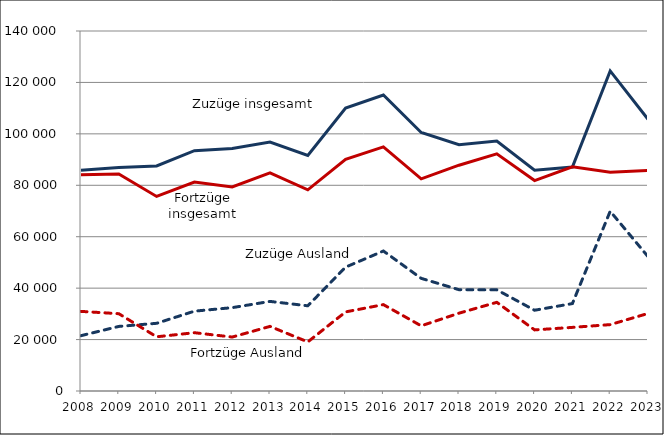
| Category | Zuzüge insgesamt | Zuzüge Ausland | Fortzüge insgesamt | Fortzüge Ausland |
|---|---|---|---|---|
| 2008.0 | 85859 | 21514 | 84108 | 30961 |
| 2009.0 | 86879 | 25112 | 84411 | 30062 |
| 2010.0 | 87538 | 26324 | 75668 | 21078 |
| 2011.0 | 93466 | 31048 | 81231 | 22674 |
| 2012.0 | 94346 | 32412 | 79335 | 20979 |
| 2013.0 | 96782 | 34839 | 84823 | 25125 |
| 2014.0 | 91594 | 33131 | 78218 | 19091 |
| 2015.0 | 110070 | 48173 | 90072 | 30757 |
| 2016.0 | 115115 | 54438 | 94914 | 33587 |
| 2017.0 | 100534 | 43809 | 82525 | 25341 |
| 2018.0 | 95790 | 39392 | 87811 | 30263 |
| 2019.0 | 97239 | 39348 | 92236 | 34484 |
| 2020.0 | 85885 | 31407 | 81828 | 23767 |
| 2021.0 | 87108 | 33996 | 87178 | 24741 |
| 2022.0 | 124493 | 69908 | 85065 | 25817 |
| 2023.0 | 105665 | 52260 | 85778 | 30157 |